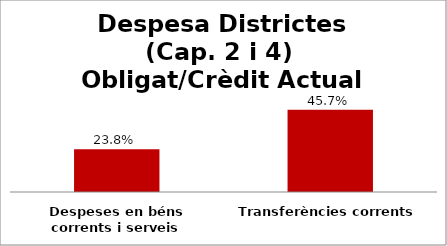
| Category | Series 0 |
|---|---|
| Despeses en béns corrents i serveis | 0.238 |
| Transferències corrents | 0.457 |